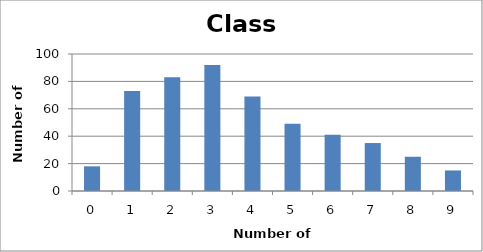
| Category | Series 0 |
|---|---|
| 0.0 | 18 |
| 1.0 | 73 |
| 2.0 | 83 |
| 3.0 | 92 |
| 4.0 | 69 |
| 5.0 | 49 |
| 6.0 | 41 |
| 7.0 | 35 |
| 8.0 | 25 |
| 9.0 | 15 |